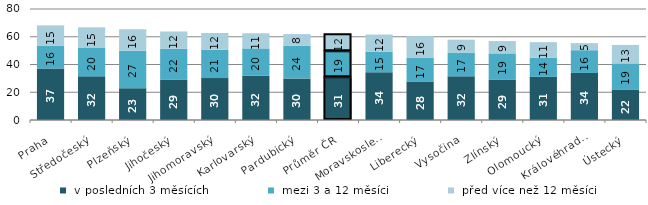
| Category |  v posledních 3 měsících |  mezi 3 a 12 měsíci |  před více než 12 měsíci |
|---|---|---|---|
|   Praha | 37.1 | 16.3 | 14.8 |
|   Středočeský | 31.5 | 20.4 | 14.9 |
|   Plzeňský | 22.9 | 27 | 15.5 |
|   Jihočeský | 29.2 | 22.2 | 12.4 |
|   Jihomoravský | 30.2 | 20.5 | 12 |
|   Karlovarský | 31.8 | 19.8 | 10.9 |
|   Pardubický | 30 | 23.5 | 8.4 |
| Průměr ČR | 30.8 | 18.8 | 12.2 |
|   Moravskoslezský | 34.4 | 14.9 | 12.3 |
|   Liberecký | 27.7 | 17.3 | 15.5 |
|   Vysočina | 31.5 | 17.1 | 9.3 |
|   Zlínský | 29.2 | 18.8 | 8.9 |
|   Olomoucký | 31.1 | 13.8 | 11.2 |
|   Královéhradecký | 33.9 | 16.4 | 5.1 |
|   Ústecký | 22 | 18.8 | 13.3 |